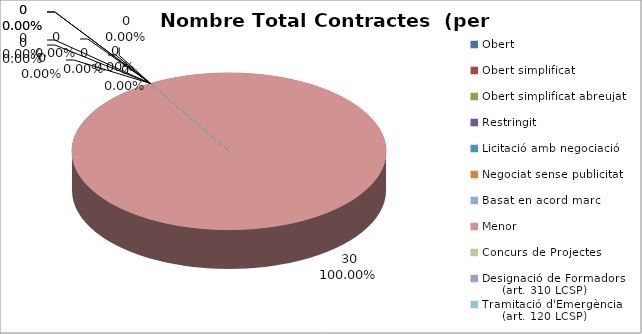
| Category | Nombre Total Contractes |
|---|---|
| Obert | 0 |
| Obert simplificat | 0 |
| Obert simplificat abreujat | 0 |
| Restringit | 0 |
| Licitació amb negociació | 0 |
| Negociat sense publicitat | 0 |
| Basat en acord marc | 0 |
| Menor | 30 |
| Concurs de Projectes | 0 |
| Designació de Formadors
     (art. 310 LCSP) | 0 |
| Tramitació d'Emergència
     (art. 120 LCSP) | 0 |